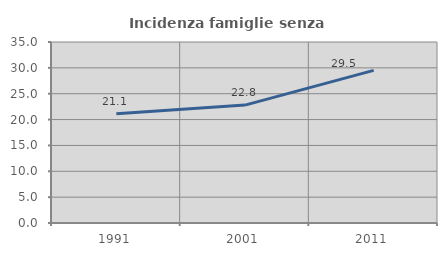
| Category | Incidenza famiglie senza nuclei |
|---|---|
| 1991.0 | 21.131 |
| 2001.0 | 22.802 |
| 2011.0 | 29.51 |